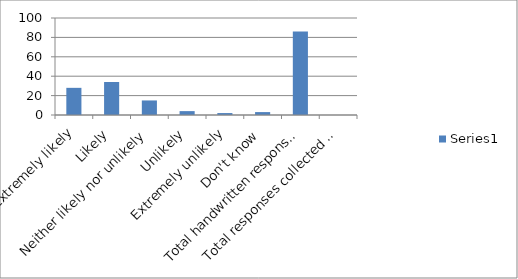
| Category | Series 0 |
|---|---|
| Extremely likely | 28 |
| Likely | 34 |
| Neither likely nor unlikely | 15 |
| Unlikely | 4 |
| Extremely unlikely | 2 |
| Don't know | 3 |
| Total handwritten responses | 86 |
| Total responses collected from other methods | 0 |